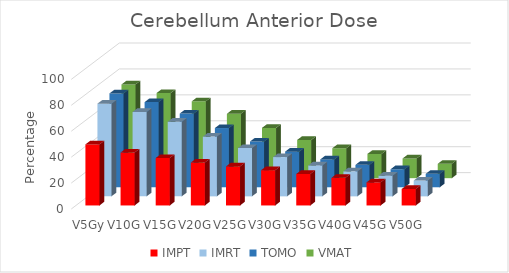
| Category | IMPT | IMRT | TOMO | VMAT |
|---|---|---|---|---|
| V5Gy | 47.1 | 71.5 | 72.4 | 72.3 |
| V10Gy | 40.8 | 65.1 | 65.7 | 65.7 |
| V15Gy | 36.6 | 57.6 | 56.9 | 59.3 |
| V20Gy | 33.1 | 46.1 | 45.7 | 49.7 |
| V25Gy | 30.1 | 37.3 | 35.3 | 38.8 |
| V30Gy | 27.2 | 30.3 | 27.5 | 29.5 |
| V35Gy | 24.3 | 23.9 | 21.5 | 23.1 |
| V40Gy | 21.3 | 19.3 | 17.3 | 18.7 |
| V45Gy | 17.8 | 16 | 13.9 | 15.2 |
| V50Gy | 12.7 | 12.2 | 10.4 | 11.1 |